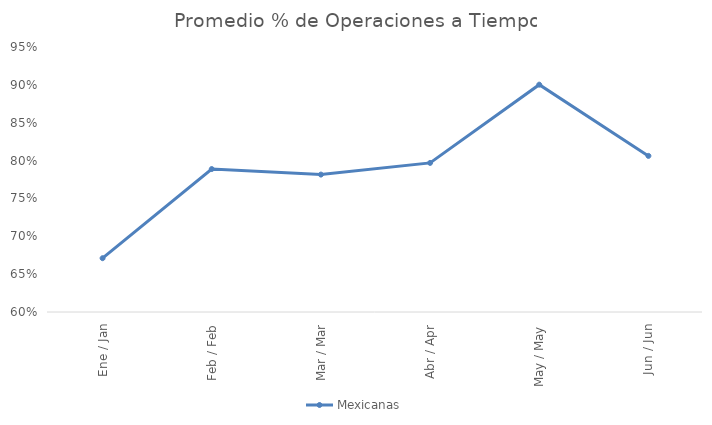
| Category | Mexicanas |
|---|---|
| Ene / Jan | 0.671 |
| Feb / Feb | 0.789 |
| Mar / Mar | 0.781 |
| Abr / Apr | 0.797 |
| May / May | 0.9 |
| Jun / Jun | 0.806 |